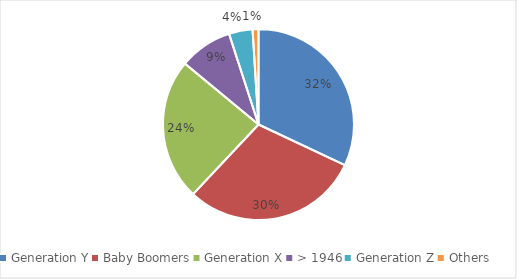
| Category | Series 0 |
|---|---|
| Generation Y | 0.32 |
| Baby Boomers | 0.3 |
| Generation X | 0.24 |
| > 1946 | 0.09 |
| Generation Z | 0.04 |
| Others | 0.01 |